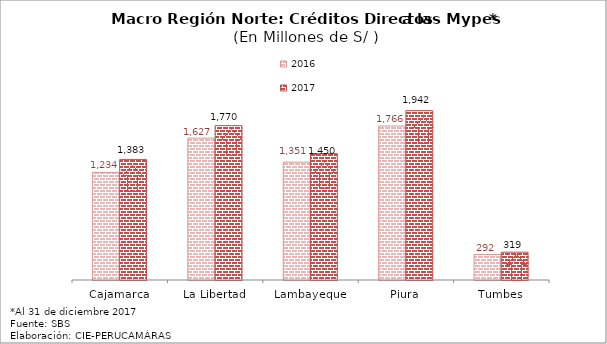
| Category | 2016 | 2017 |
|---|---|---|
| Cajamarca | 1234.348 | 1382.794 |
| La Libertad | 1627.083 | 1770.336 |
| Lambayeque | 1351.332 | 1449.544 |
| Piura | 1766.184 | 1942.108 |
| Tumbes | 291.934 | 318.844 |